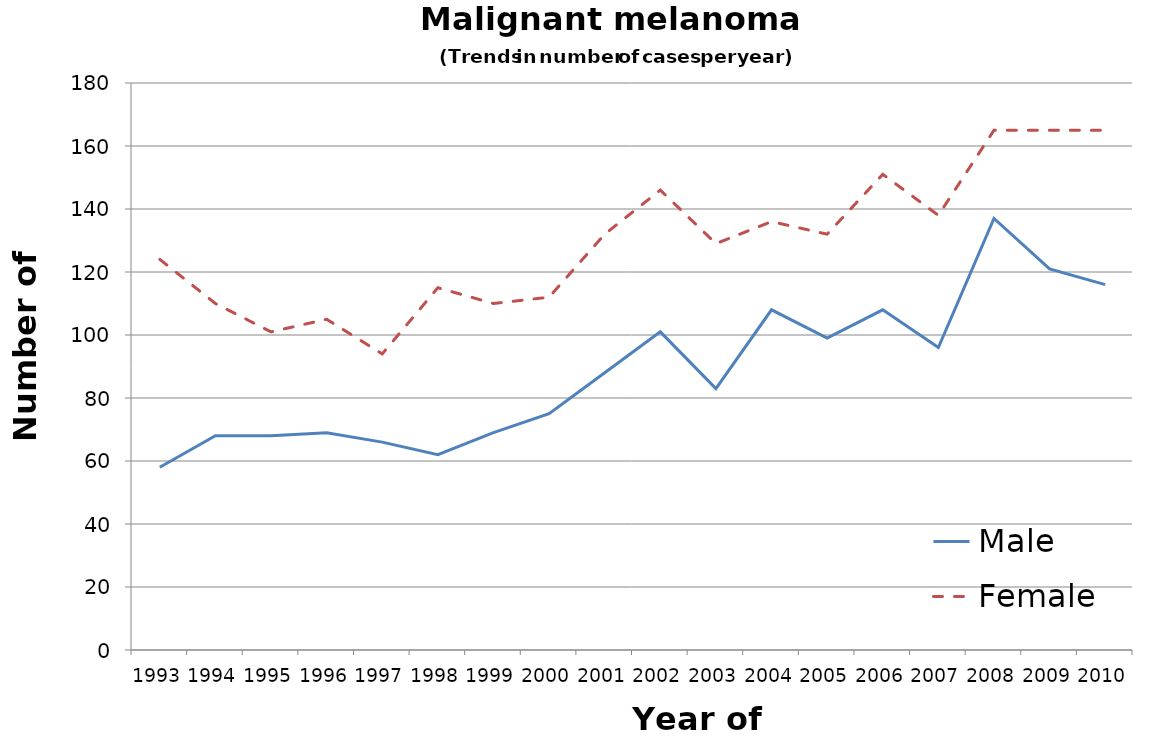
| Category | Male | Female |
|---|---|---|
| 1993.0 | 58 | 124 |
| 1994.0 | 68 | 110 |
| 1995.0 | 68 | 101 |
| 1996.0 | 69 | 105 |
| 1997.0 | 66 | 94 |
| 1998.0 | 62 | 115 |
| 1999.0 | 69 | 110 |
| 2000.0 | 75 | 112 |
| 2001.0 | 88 | 132 |
| 2002.0 | 101 | 146 |
| 2003.0 | 83 | 129 |
| 2004.0 | 108 | 136 |
| 2005.0 | 99 | 132 |
| 2006.0 | 108 | 151 |
| 2007.0 | 96 | 138 |
| 2008.0 | 137 | 165 |
| 2009.0 | 121 | 165 |
| 2010.0 | 116 | 165 |